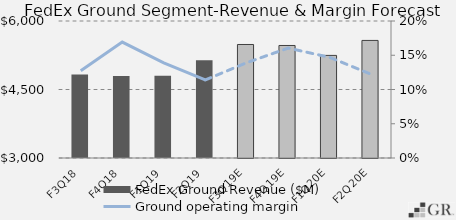
| Category | FedEx Ground Revenue ($M) |
|---|---|
|  F3Q18  | 4828.372 |
|  F4Q18  | 4796.767 |
|  F1Q19  | 4798.91 |
|  F2Q19  | 5141.812 |
|  F3Q19E  | 5485.452 |
|  F4Q19E  | 5464.111 |
|  F1Q20E  | 5246.655 |
|  F2Q20E  | 5574.383 |